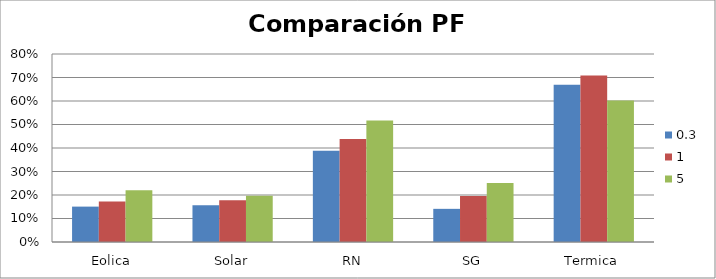
| Category | 0.3 | 1 | 5 |
|---|---|---|---|
| Eolica | 0.151 | 0.172 | 0.22 |
| Solar | 0.157 | 0.177 | 0.197 |
| RN | 0.389 | 0.438 | 0.517 |
| SG | 0.141 | 0.196 | 0.252 |
| Termica | 0.669 | 0.708 | 0.603 |